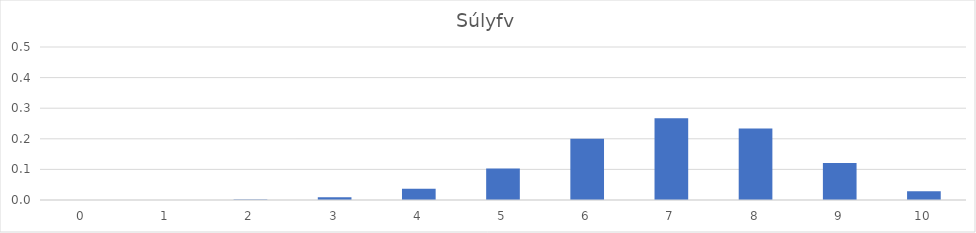
| Category | Series 0 |
|---|---|
| 0.0 | 0 |
| 1.0 | 0 |
| 2.0 | 0.001 |
| 3.0 | 0.009 |
| 4.0 | 0.037 |
| 5.0 | 0.103 |
| 6.0 | 0.2 |
| 7.0 | 0.267 |
| 8.0 | 0.233 |
| 9.0 | 0.121 |
| 10.0 | 0.028 |